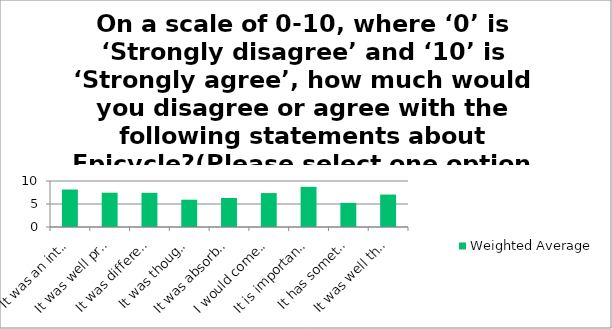
| Category | Weighted Average |
|---|---|
| It was an interesting idea | 8.15 |
| It was well produced and presented | 7.46 |
| It was different from things I’ve experienced before | 7.43 |
| It was thought-provoking | 5.93 |
| It was absorbing and held my attention | 6.31 |
| I would come to something like this again | 7.38 |
| It is important that it's happening here (in Hull) | 8.73 |
| It has something to say about the world in which we live | 5.24 |
| It was well thought through and put together | 7.05 |